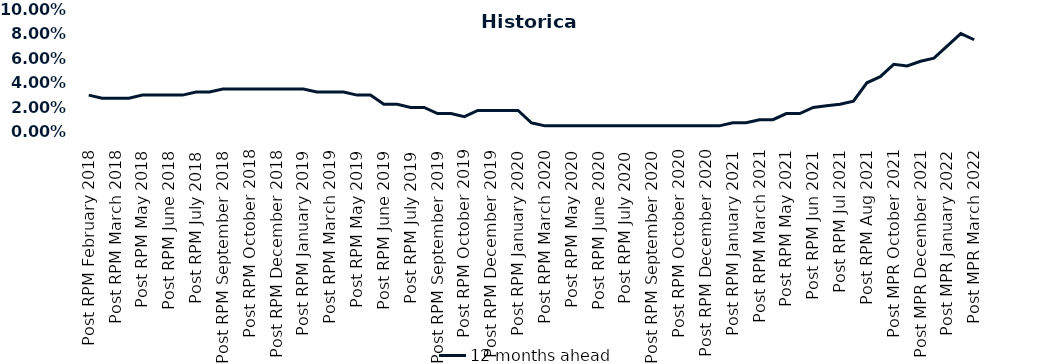
| Category | 12 months ahead |
|---|---|
| Post RPM February 2018 | 0.03 |
| Pre RPM March 2018 | 0.028 |
| Post RPM March 2018 | 0.028 |
| Pre RPM May 2018 | 0.028 |
| Post RPM May 2018 | 0.03 |
| Pre RPM June 2018 | 0.03 |
| Post RPM June 2018 | 0.03 |
| Pre RPM July 2018 | 0.03 |
| Post RPM July 2018 | 0.032 |
| Pre RPM September 2018 | 0.032 |
| Post RPM September 2018 | 0.035 |
| Pre RPM October 2018 | 0.035 |
| Post RPM October 2018 | 0.035 |
| Pre RPM December 2018 | 0.035 |
| Post RPM December 2018 | 0.035 |
| Pre RPM January 2019 | 0.035 |
| Post RPM January 2019 | 0.035 |
| Pre RPM March 2019 | 0.032 |
| Post RPM March 2019 | 0.032 |
| Pre RPM May 2019 | 0.032 |
| Post RPM May 2019 | 0.03 |
| Pre RPM June 2019 | 0.03 |
| Post RPM June 2019 | 0.022 |
| Pre RPM July 2019 | 0.022 |
| Post RPM July 2019 | 0.02 |
| Pre RPM September 2019 | 0.02 |
| Post RPM September 2019 | 0.015 |
| Pre RPM October 2019 | 0.015 |
| Post RPM October 2019 | 0.012 |
| Pre RPM December 2019 | 0.018 |
| Post RPM December 2019 | 0.018 |
| Pre RPM January 2020 | 0.018 |
| Post RPM January 2020 | 0.018 |
| Pre RPM March 2020 | 0.008 |
| Post RPM March 2020 | 0.005 |
| Pre RPM May 2020 | 0.005 |
| Post RPM May 2020 | 0.005 |
| Pre RPM June 2020 | 0.005 |
| Post RPM June 2020 | 0.005 |
| Pre RPM July 2020 | 0.005 |
| Post RPM July 2020 | 0.005 |
| Pre RPM September 2020 | 0.005 |
| Post RPM September 2020 | 0.005 |
| Pre RPM October 2020 | 0.005 |
| Post RPM October 2020 | 0.005 |
| Pre RPM December 2020 | 0.005 |
|  Post RPM December 2020 | 0.005 |
| Pre RPM January 2021 | 0.005 |
| Post RPM January 2021 | 0.008 |
|  Pre RPM March 2021 | 0.008 |
|  Post RPM March 2021 | 0.01 |
|  Pre RPM May 2021 | 0.01 |
|  Post RPM May 2021 | 0.015 |
|  Pre RPM Jun 2021 | 0.015 |
|   Post RPM Jun 2021 | 0.02 |
| Pre RPM Jul 2021 | 0.021 |
|  Post RPM Jul 2021 | 0.022 |
| Pre RPM Aug 2021 | 0.025 |
|  Post RPM Aug 2021 | 0.04 |
| Pre MPR October 2021 | 0.045 |
| Post MPR October 2021 | 0.055 |
| Pre MPR December 2021 | 0.054 |
| Post MPR December 2021 | 0.058 |
| Pre MPR January 2022 | 0.06 |
| Post MPR January 2022 | 0.07 |
| Pre MPR March 2022 | 0.08 |
| Post MPR March 2022 | 0.075 |